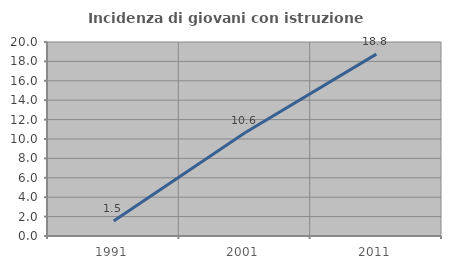
| Category | Incidenza di giovani con istruzione universitaria |
|---|---|
| 1991.0 | 1.546 |
| 2001.0 | 10.638 |
| 2011.0 | 18.75 |